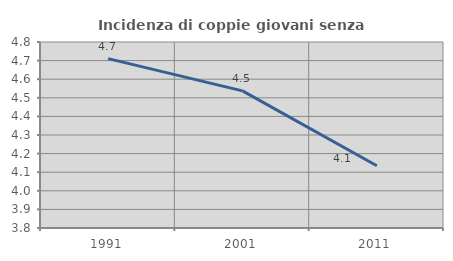
| Category | Incidenza di coppie giovani senza figli |
|---|---|
| 1991.0 | 4.711 |
| 2001.0 | 4.537 |
| 2011.0 | 4.135 |